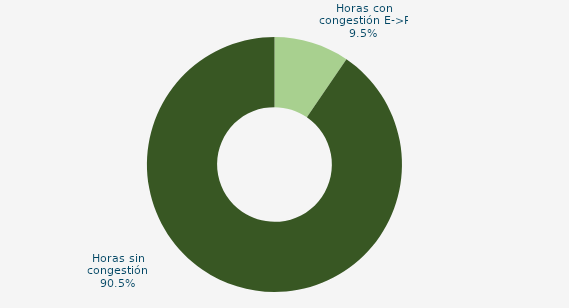
| Category | Horas con congestión E->P |
|---|---|
| Horas con congestión E->P | 9.543 |
| Horas con congestión P->E | 0 |
| Horas sin congestión | 90.457 |